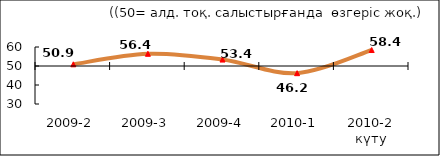
| Category | Диф.индекс ↓ |
|---|---|
| 2009-2 | 50.89 |
| 2009-3 | 56.415 |
| 2009-4 | 53.385 |
| 2010-1 | 46.225 |
| 2010-2 күту | 58.405 |